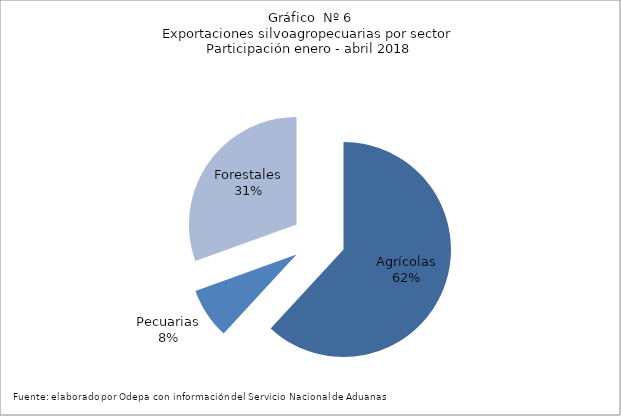
| Category | Series 0 |
|---|---|
| Agrícolas | 3952080 |
| Pecuarias | 487164 |
| Forestales | 1950412 |